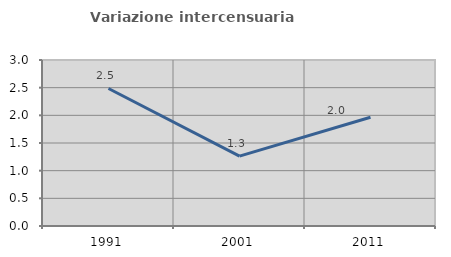
| Category | Variazione intercensuaria annua |
|---|---|
| 1991.0 | 2.486 |
| 2001.0 | 1.263 |
| 2011.0 | 1.966 |